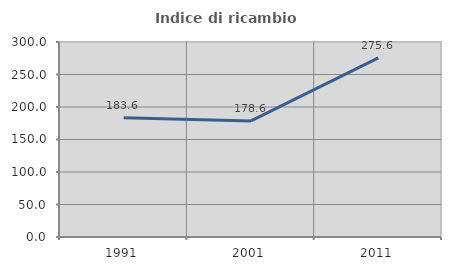
| Category | Indice di ricambio occupazionale  |
|---|---|
| 1991.0 | 183.607 |
| 2001.0 | 178.571 |
| 2011.0 | 275.61 |